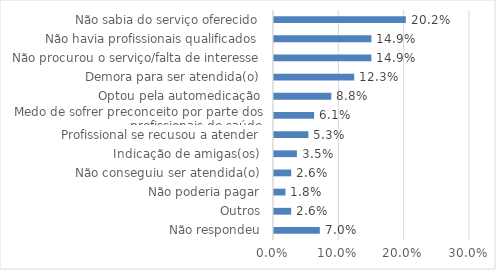
| Category | Series 0 |
|---|---|
| Não respondeu | 0.07 |
| Outros | 0.026 |
| Não poderia pagar | 0.018 |
| Não conseguiu ser atendida(o) | 0.026 |
| Indicação de amigas(os) | 0.035 |
| Profissional se recusou a atender | 0.053 |
| Medo de sofrer preconceito por parte dos profissionais de saúde | 0.061 |
| Optou pela automedicação | 0.088 |
| Demora para ser atendida(o) | 0.123 |
| Não procurou o serviço/falta de interesse | 0.149 |
| Não havia profissionais qualificados | 0.149 |
| Não sabia do serviço oferecido | 0.202 |